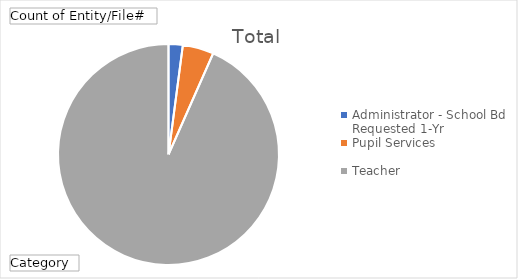
| Category | Total |
|---|---|
| Administrator - School Bd Requested 1-Yr | 82 |
| Pupil Services | 179 |
| Teacher | 3681 |